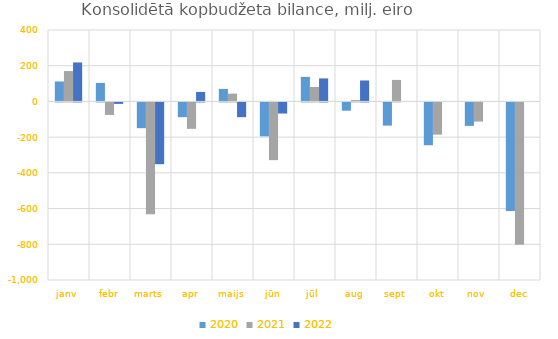
| Category | 2020 | 2021 | 2022 |
|---|---|---|---|
| janv | 111895.871 | 170157.398 | 218389.091 |
| febr | 103710.663 | -70037.902 | -8203.95 |
| marts | -144293.056 | -626307.766 | -345869.737 |
| apr | -82622.753 | -147810.305 | 53138.837 |
| maijs | 70036.276 | 43702.036 | -82553.768 |
| jūn | -190113.001 | -323251.437 | -61976.694 |
| jūl | 137554.965 | 80650.706 | 128860.015 |
| aug | -46323.774 | 8217.929 | 117341.161 |
| sept | -129953.415 | 120460.062 | 0 |
| okt | -239787.453 | -180467.443 | 0 |
| nov | -131403.441 | -107114.455 | 0 |
| dec | -607594.717 | -796518.828 | 0 |